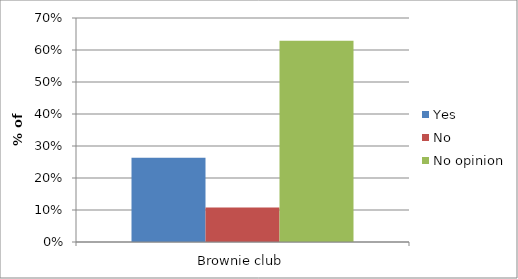
| Category | Yes | No | No opinion |
|---|---|---|---|
| Brownie club | 0.263 | 0.108 | 0.629 |